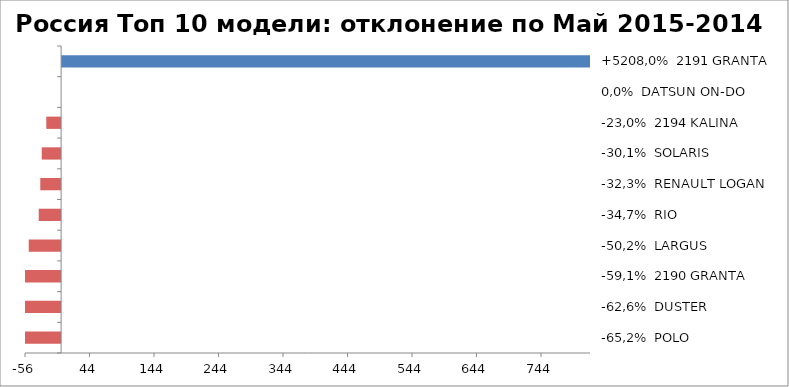
| Category | Россия Топ 10 модели: отклонение по Май 2015-2014 |
|---|---|
| -65,2%  POLO | -65.243 |
| -62,6%  DUSTER | -62.554 |
| -59,1%  2190 GRANTA | -59.077 |
| -50,2%  LARGUS | -50.227 |
| -34,7%  RIO | -34.696 |
| -32,3%  RENAULT LOGAN | -32.306 |
| -30,1%  SOLARIS | -30.051 |
| -23,0%  2194 KALINA | -22.991 |
| 0,0%  DATSUN ON-DO | 0 |
| +5208,0%  2191 GRANTA | 5208 |